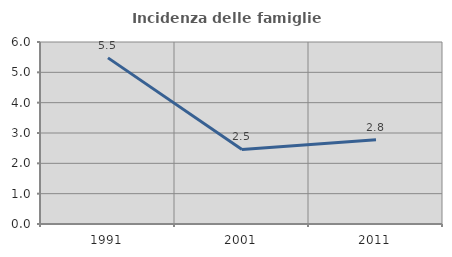
| Category | Incidenza delle famiglie numerose |
|---|---|
| 1991.0 | 5.476 |
| 2001.0 | 2.459 |
| 2011.0 | 2.774 |